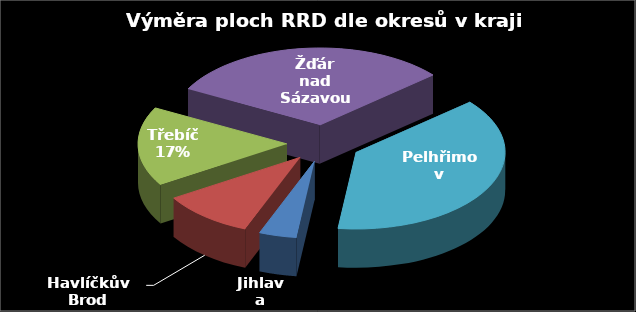
| Category | Výměra [ha] |
|---|---|
| Jihlava | 9.92 |
| Havlíčkův Brod | 24.62 |
| Třebíč | 40.47 |
| Žďár nad Sázavou | 75.51 |
| Pelhřimov | 93.04 |